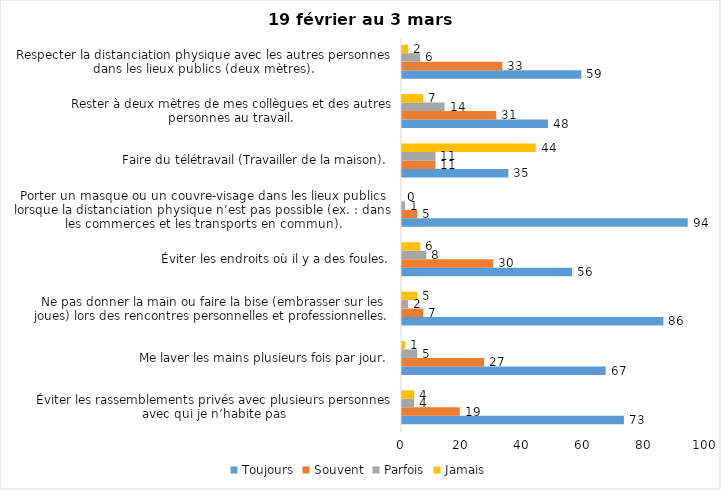
| Category | Toujours | Souvent | Parfois | Jamais |
|---|---|---|---|---|
| Éviter les rassemblements privés avec plusieurs personnes avec qui je n’habite pas | 73 | 19 | 4 | 4 |
| Me laver les mains plusieurs fois par jour. | 67 | 27 | 5 | 1 |
| Ne pas donner la main ou faire la bise (embrasser sur les joues) lors des rencontres personnelles et professionnelles. | 86 | 7 | 2 | 5 |
| Éviter les endroits où il y a des foules. | 56 | 30 | 8 | 6 |
| Porter un masque ou un couvre-visage dans les lieux publics lorsque la distanciation physique n’est pas possible (ex. : dans les commerces et les transports en commun). | 94 | 5 | 1 | 0 |
| Faire du télétravail (Travailler de la maison). | 35 | 11 | 11 | 44 |
| Rester à deux mètres de mes collègues et des autres personnes au travail. | 48 | 31 | 14 | 7 |
| Respecter la distanciation physique avec les autres personnes dans les lieux publics (deux mètres). | 59 | 33 | 6 | 2 |